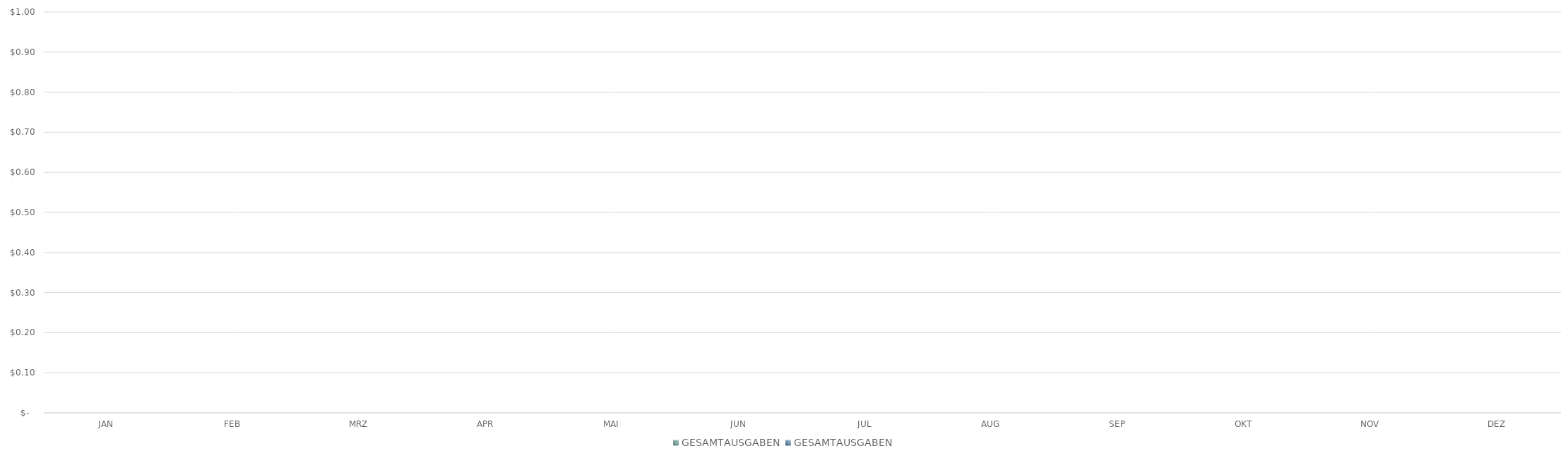
| Category | GESAMTAUSGABEN |
|---|---|
| JAN | 0 |
| FEB | 0 |
| MRZ | 0 |
| APR | 0 |
| MAI | 0 |
| JUN | 0 |
| JUL | 0 |
| AUG | 0 |
| SEP | 0 |
| OKT | 0 |
| NOV | 0 |
| DEZ | 0 |